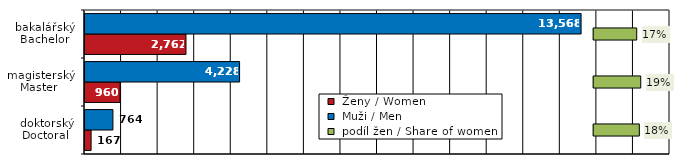
| Category |  Ženy / Women |  Muži / Men |
|---|---|---|
| doktorský
Doctoral  | 167 | 764 |
| magisterský
Master  | 960 | 4228 |
| bakalářský
Bachelor | 2762 | 13568 |